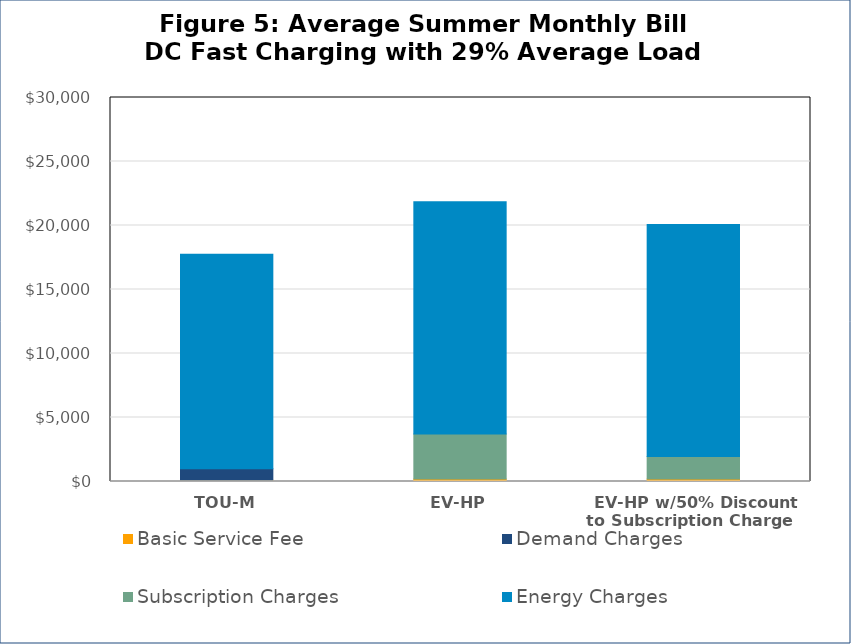
| Category | Basic Service Fee | Demand Charges | Subscription Charges | Energy Charges |
|---|---|---|---|---|
|  TOU-M  | 101.56 | 888 | 0 | 16768.404 |
|  EV-HP  | 186.304 | 0 | 3534.15 | 18126.643 |
|  EV-HP w/50% Discount to Subscription Charge  | 186.304 | 0 | 1767.075 | 18126.643 |